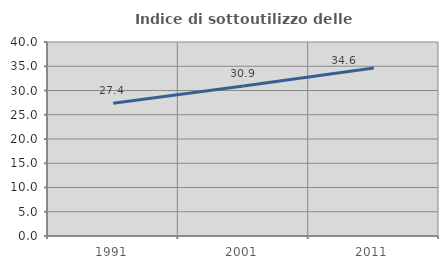
| Category | Indice di sottoutilizzo delle abitazioni  |
|---|---|
| 1991.0 | 27.355 |
| 2001.0 | 30.938 |
| 2011.0 | 34.646 |